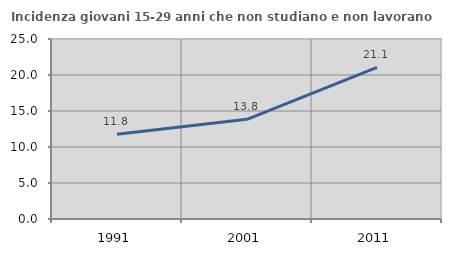
| Category | Incidenza giovani 15-29 anni che non studiano e non lavorano  |
|---|---|
| 1991.0 | 11.765 |
| 2001.0 | 13.846 |
| 2011.0 | 21.053 |